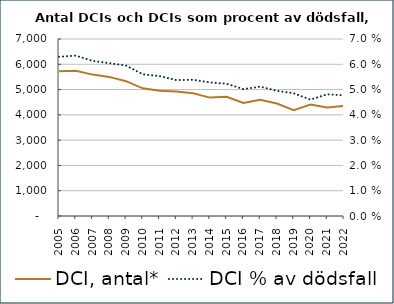
| Category | DCI, antal* |
|---|---|
| 2005 | 5725 |
| 2006 | 5740 |
| 2007 | 5592 |
| 2008 | 5501 |
| 2009 | 5331 |
| 2010 | 5049 |
| 2011 | 4953 |
| 2012 | 4923 |
| 2013 | 4854 |
| 2014 | 4682 |
| 2015 | 4712 |
| 2016 | 4474 |
| 2017 | 4599 |
| 2018 | 4447 |
| 2019 | 4189 |
| 2020 | 4405 |
| 2021 | 4296 |
| 2022 | 4350 |